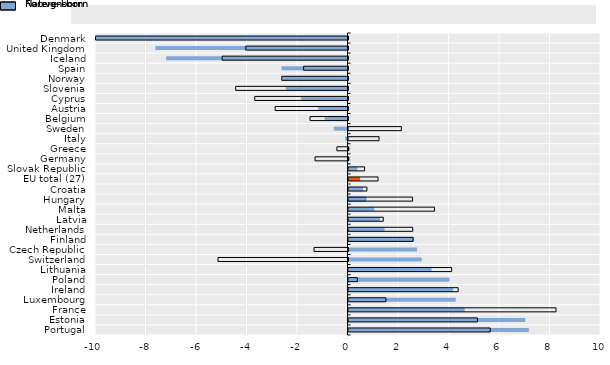
| Category | Foreign-born | Native-born |
|---|---|---|
| Denmark | -11.678 | -14.25 |
| United Kingdom | -7.607 | -4.047 |
| Iceland | -7.184 | -4.983 |
| Spain | -2.612 | -1.758 |
| Norway | -2.586 | -2.623 |
| Slovenia | -2.446 | -4.448 |
| Cyprus | -1.84 | -3.693 |
| Austria | -1.16 | -2.885 |
| Belgium | -0.907 | -1.503 |
| Sweden | -0.541 | 2.094 |
| Italy | -0.093 | 1.21 |
| Greece | 0.065 | -0.44 |
| Germany | 0.068 | -1.306 |
| Slovak Republic | 0.343 | 0.638 |
| EU total (27) | 0.454 | 1.171 |
| Croatia | 0.572 | 0.729 |
| Hungary | 0.683 | 2.539 |
| Malta | 1.022 | 3.408 |
| Latvia | 1.247 | 1.376 |
| Netherlands | 1.427 | 2.545 |
| Finland | 2.588 | 2.559 |
| Czech Republic | 2.712 | -1.345 |
| Switzerland | 2.9 | -5.149 |
| Lithuania | 3.288 | 4.085 |
| Poland | 3.997 | 0.349 |
| Ireland | 4.15 | 4.343 |
| Luxembourg | 4.243 | 1.484 |
| France | 4.599 | 8.219 |
| Estonia | 6.994 | 5.108 |
| Portugal | 7.14 | 5.612 |